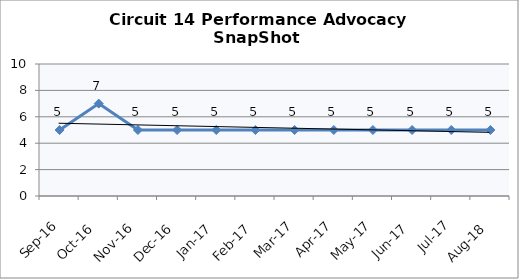
| Category | Circuit 14 |
|---|---|
| Sep-16 | 5 |
| Oct-16 | 7 |
| Nov-16 | 5 |
| Dec-16 | 5 |
| Jan-17 | 5 |
| Feb-17 | 5 |
| Mar-17 | 5 |
| Apr-17 | 5 |
| May-17 | 5 |
| Jun-17 | 5 |
| Jul-17 | 5 |
| Aug-18 | 5 |